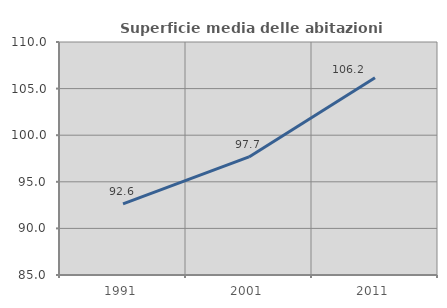
| Category | Superficie media delle abitazioni occupate |
|---|---|
| 1991.0 | 92.632 |
| 2001.0 | 97.671 |
| 2011.0 | 106.155 |